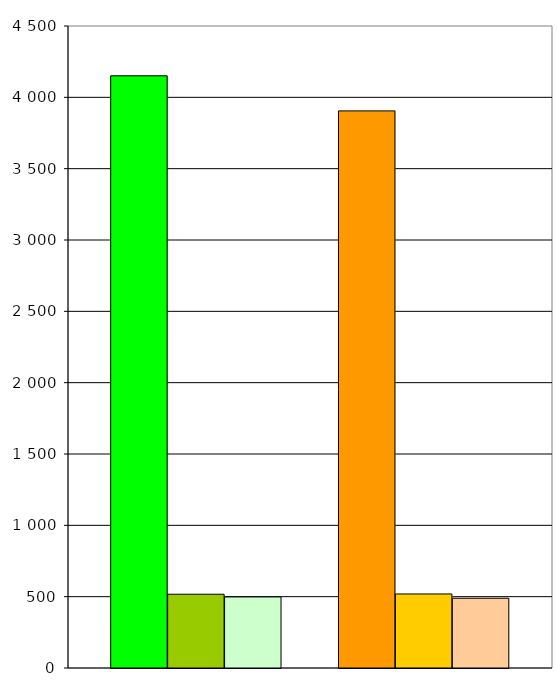
| Category | Series 0 | Series 1 | Series 2 | Series 3 | Series 4 | Series 5 | Series 6 |
|---|---|---|---|---|---|---|---|
| 0 | 4151 | 517 | 498 |  | 3905 | 519 | 489 |